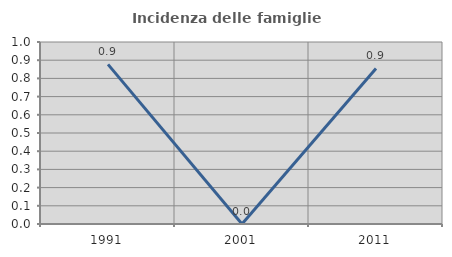
| Category | Incidenza delle famiglie numerose |
|---|---|
| 1991.0 | 0.877 |
| 2001.0 | 0 |
| 2011.0 | 0.855 |